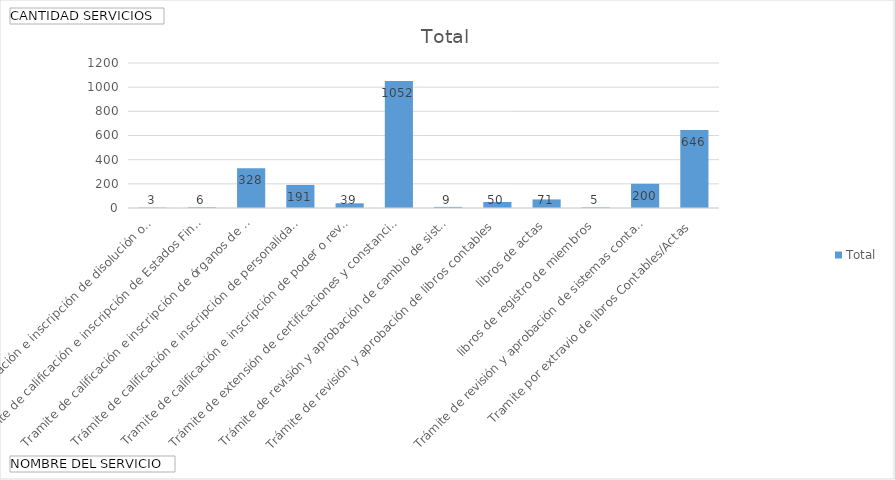
| Category | Total |
|---|---|
| Tramite de calificación e inscripción de disolución o liquidación | 3 |
| Tramite de calificación e inscripción de Estados Financieros | 6 |
| Tramite de calificación e inscripción de órganos de administración  | 328 |
| Trámite de calificación e inscripción de personalidad jurídica y estatutos | 191 |
| Tramite de calificación e inscripción de poder o revocatoria | 39 |
| Trámite de extensión de certificaciones y constancias | 1052 |
| Trámite de revisión y aprobación de cambio de sistema contable informal a formal | 9 |
| Trámite de revisión y aprobación de libros contables, libros de actas, libros de registro de miembros | 50 |
| Trámite de revisión y aprobación de sistemas contables formales e informales | 71 |
| Tramite por extravio de libros Contables/Actas | 5 |
| Tramite de calificación e inscripción de nómina de miembros | 200 |
| Tramite de calificación e inscripción de Estados Financieros  | 646 |